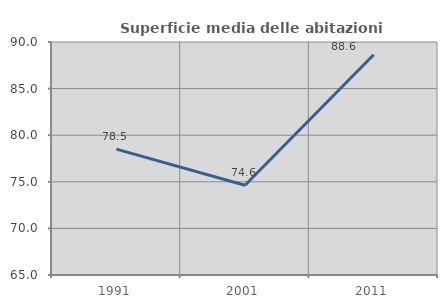
| Category | Superficie media delle abitazioni occupate |
|---|---|
| 1991.0 | 78.51 |
| 2001.0 | 74.628 |
| 2011.0 | 88.625 |